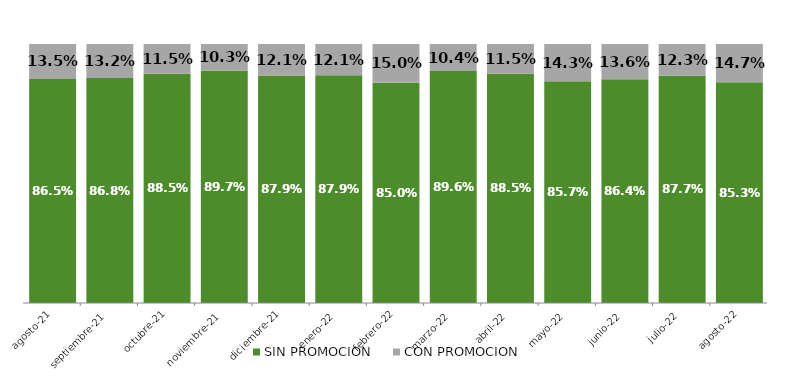
| Category | SIN PROMOCION   | CON PROMOCION   |
|---|---|---|
| 2021-08-01 | 0.865 | 0.135 |
| 2021-09-01 | 0.868 | 0.132 |
| 2021-10-01 | 0.885 | 0.115 |
| 2021-11-01 | 0.897 | 0.103 |
| 2021-12-01 | 0.879 | 0.121 |
| 2022-01-01 | 0.879 | 0.121 |
| 2022-02-01 | 0.85 | 0.15 |
| 2022-03-01 | 0.896 | 0.104 |
| 2022-04-01 | 0.885 | 0.115 |
| 2022-05-01 | 0.857 | 0.143 |
| 2022-06-01 | 0.864 | 0.136 |
| 2022-07-01 | 0.877 | 0.123 |
| 2022-08-01 | 0.853 | 0.147 |